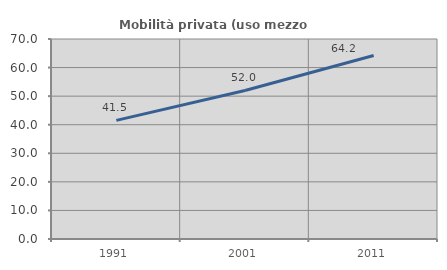
| Category | Mobilità privata (uso mezzo privato) |
|---|---|
| 1991.0 | 41.52 |
| 2001.0 | 51.986 |
| 2011.0 | 64.2 |